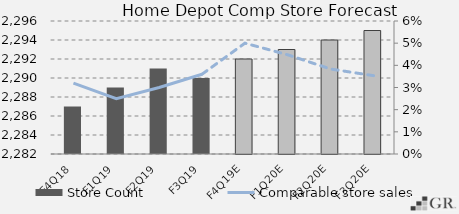
| Category | Store Count  |
|---|---|
|  F4Q18  | 2287 |
|  F1Q19  | 2289 |
|  F2Q19  | 2291 |
|  F3Q19  | 2290 |
|  F4Q19E  | 2292 |
|  F1Q20E  | 2293 |
|  F2Q20E  | 2294 |
|  F3Q20E  | 2295 |